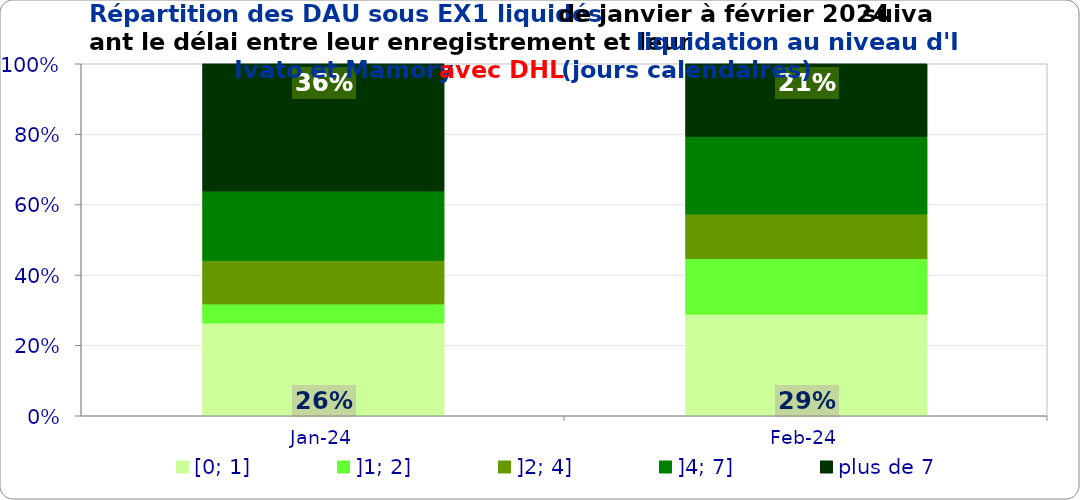
| Category | [0; 1] | ]1; 2] | ]2; 4] | ]4; 7] | plus de 7 |
|---|---|---|---|---|---|
| 2024-01-01 | 0.263 | 0.054 | 0.124 | 0.197 | 0.362 |
| 2024-02-01 | 0.289 | 0.157 | 0.127 | 0.22 | 0.207 |